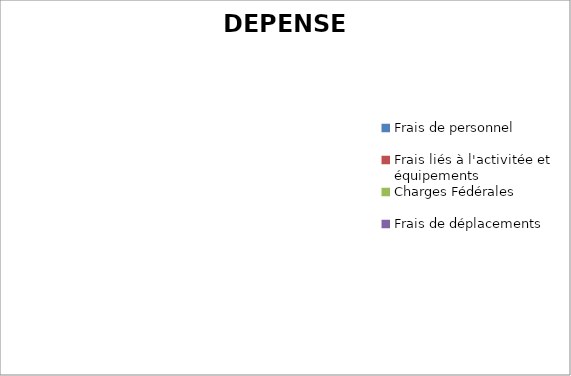
| Category | Series 0 | Series 1 |
|---|---|---|
| Frais de personnel | 0 | 0 |
| Frais liés à l'activitée et équipements | 0 | 0 |
| Charges Fédérales | 0 | 0 |
| Frais de déplacements | 0 | 0 |